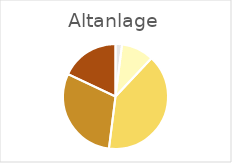
| Category | Series 0 |
|---|---|
| 0 | 0.02 |
| 1 | 0.1 |
| 2 | 0.4 |
| 3 | 0.3 |
| 4 | 0.18 |